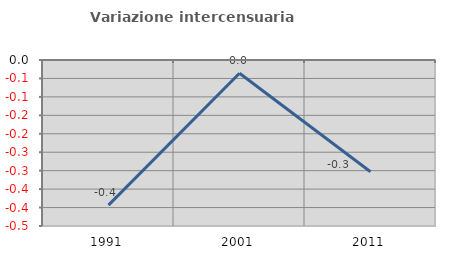
| Category | Variazione intercensuaria annua |
|---|---|
| 1991.0 | -0.393 |
| 2001.0 | -0.036 |
| 2011.0 | -0.303 |